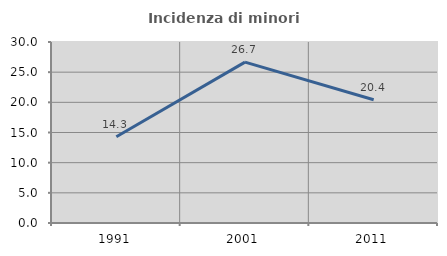
| Category | Incidenza di minori stranieri |
|---|---|
| 1991.0 | 14.286 |
| 2001.0 | 26.667 |
| 2011.0 | 20.435 |